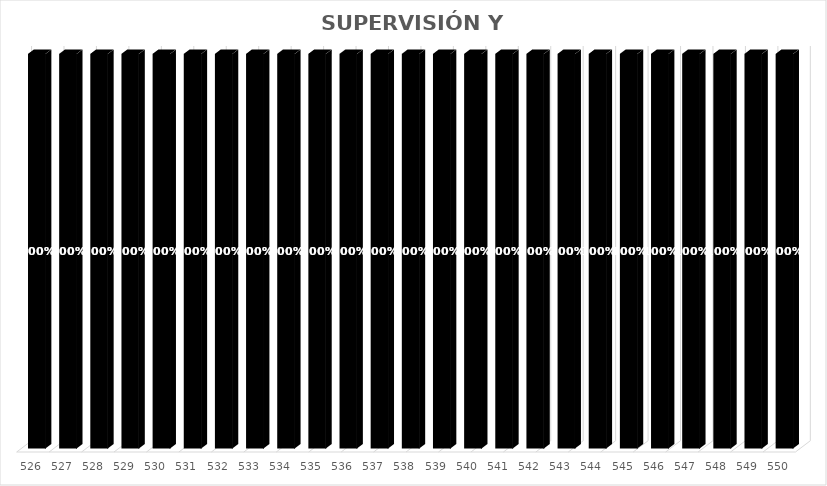
| Category | % Avance |
|---|---|
| 526.0 | 1 |
| 527.0 | 1 |
| 528.0 | 1 |
| 529.0 | 1 |
| 530.0 | 1 |
| 531.0 | 1 |
| 532.0 | 1 |
| 533.0 | 1 |
| 534.0 | 1 |
| 535.0 | 1 |
| 536.0 | 1 |
| 537.0 | 1 |
| 538.0 | 1 |
| 539.0 | 1 |
| 540.0 | 1 |
| 541.0 | 1 |
| 542.0 | 1 |
| 543.0 | 1 |
| 544.0 | 1 |
| 545.0 | 1 |
| 546.0 | 1 |
| 547.0 | 1 |
| 548.0 | 1 |
| 549.0 | 1 |
| 550.0 | 1 |